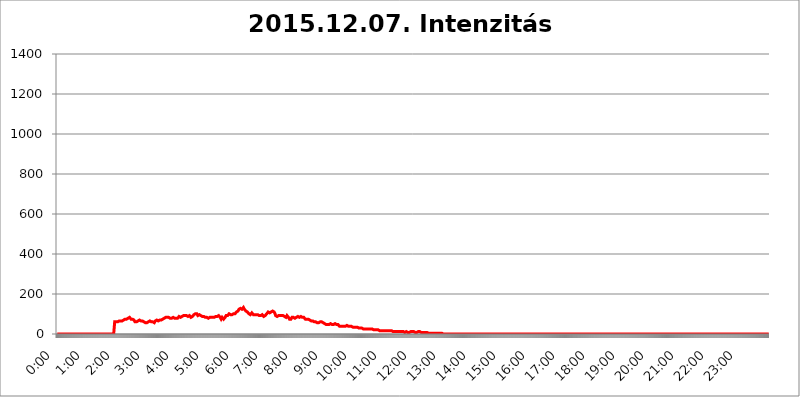
| Category | 2015.12.07. Intenzitás [W/m^2] |
|---|---|
| 0.0 | 0 |
| 0.0006944444444444445 | 0 |
| 0.001388888888888889 | 0 |
| 0.0020833333333333333 | 0 |
| 0.002777777777777778 | 0 |
| 0.003472222222222222 | 0 |
| 0.004166666666666667 | 0 |
| 0.004861111111111111 | 0 |
| 0.005555555555555556 | 0 |
| 0.0062499999999999995 | 0 |
| 0.006944444444444444 | 0 |
| 0.007638888888888889 | 0 |
| 0.008333333333333333 | 0 |
| 0.009027777777777779 | 0 |
| 0.009722222222222222 | 0 |
| 0.010416666666666666 | 0 |
| 0.011111111111111112 | 0 |
| 0.011805555555555555 | 0 |
| 0.012499999999999999 | 0 |
| 0.013194444444444444 | 0 |
| 0.013888888888888888 | 0 |
| 0.014583333333333332 | 0 |
| 0.015277777777777777 | 0 |
| 0.015972222222222224 | 0 |
| 0.016666666666666666 | 0 |
| 0.017361111111111112 | 0 |
| 0.018055555555555557 | 0 |
| 0.01875 | 0 |
| 0.019444444444444445 | 0 |
| 0.02013888888888889 | 0 |
| 0.020833333333333332 | 0 |
| 0.02152777777777778 | 0 |
| 0.022222222222222223 | 0 |
| 0.02291666666666667 | 0 |
| 0.02361111111111111 | 0 |
| 0.024305555555555556 | 0 |
| 0.024999999999999998 | 0 |
| 0.025694444444444447 | 0 |
| 0.02638888888888889 | 0 |
| 0.027083333333333334 | 0 |
| 0.027777777777777776 | 0 |
| 0.02847222222222222 | 0 |
| 0.029166666666666664 | 0 |
| 0.029861111111111113 | 0 |
| 0.030555555555555555 | 0 |
| 0.03125 | 0 |
| 0.03194444444444445 | 0 |
| 0.03263888888888889 | 0 |
| 0.03333333333333333 | 0 |
| 0.034027777777777775 | 0 |
| 0.034722222222222224 | 0 |
| 0.035416666666666666 | 0 |
| 0.036111111111111115 | 0 |
| 0.03680555555555556 | 0 |
| 0.0375 | 0 |
| 0.03819444444444444 | 0 |
| 0.03888888888888889 | 0 |
| 0.03958333333333333 | 0 |
| 0.04027777777777778 | 0 |
| 0.04097222222222222 | 0 |
| 0.041666666666666664 | 0 |
| 0.042361111111111106 | 0 |
| 0.04305555555555556 | 0 |
| 0.043750000000000004 | 0 |
| 0.044444444444444446 | 0 |
| 0.04513888888888889 | 0 |
| 0.04583333333333334 | 0 |
| 0.04652777777777778 | 0 |
| 0.04722222222222222 | 0 |
| 0.04791666666666666 | 0 |
| 0.04861111111111111 | 0 |
| 0.049305555555555554 | 0 |
| 0.049999999999999996 | 0 |
| 0.05069444444444445 | 0 |
| 0.051388888888888894 | 0 |
| 0.052083333333333336 | 0 |
| 0.05277777777777778 | 0 |
| 0.05347222222222222 | 0 |
| 0.05416666666666667 | 0 |
| 0.05486111111111111 | 0 |
| 0.05555555555555555 | 0 |
| 0.05625 | 0 |
| 0.05694444444444444 | 0 |
| 0.057638888888888885 | 0 |
| 0.05833333333333333 | 0 |
| 0.05902777777777778 | 0 |
| 0.059722222222222225 | 0 |
| 0.06041666666666667 | 0 |
| 0.061111111111111116 | 0 |
| 0.06180555555555556 | 0 |
| 0.0625 | 0 |
| 0.06319444444444444 | 0 |
| 0.06388888888888888 | 0 |
| 0.06458333333333334 | 0 |
| 0.06527777777777778 | 0 |
| 0.06597222222222222 | 0 |
| 0.06666666666666667 | 0 |
| 0.06736111111111111 | 0 |
| 0.06805555555555555 | 0 |
| 0.06874999999999999 | 0 |
| 0.06944444444444443 | 0 |
| 0.07013888888888889 | 0 |
| 0.07083333333333333 | 0 |
| 0.07152777777777779 | 0 |
| 0.07222222222222223 | 0 |
| 0.07291666666666667 | 0 |
| 0.07361111111111111 | 0 |
| 0.07430555555555556 | 0 |
| 0.075 | 0 |
| 0.07569444444444444 | 0 |
| 0.0763888888888889 | 0 |
| 0.07708333333333334 | 0 |
| 0.07777777777777778 | 0 |
| 0.07847222222222222 | 0 |
| 0.07916666666666666 | 0 |
| 0.0798611111111111 | 0 |
| 0.08055555555555556 | 60.85 |
| 0.08125 | 60.85 |
| 0.08194444444444444 | 60.85 |
| 0.08263888888888889 | 60.85 |
| 0.08333333333333333 | 60.85 |
| 0.08402777777777777 | 60.85 |
| 0.08472222222222221 | 60.85 |
| 0.08541666666666665 | 60.85 |
| 0.08611111111111112 | 60.85 |
| 0.08680555555555557 | 65.31 |
| 0.08750000000000001 | 65.31 |
| 0.08819444444444445 | 65.31 |
| 0.08888888888888889 | 65.31 |
| 0.08958333333333333 | 65.31 |
| 0.09027777777777778 | 65.31 |
| 0.09097222222222222 | 65.31 |
| 0.09166666666666667 | 69.775 |
| 0.09236111111111112 | 69.775 |
| 0.09305555555555556 | 69.775 |
| 0.09375 | 74.246 |
| 0.09444444444444444 | 74.246 |
| 0.09513888888888888 | 74.246 |
| 0.09583333333333333 | 74.246 |
| 0.09652777777777777 | 74.246 |
| 0.09722222222222222 | 74.246 |
| 0.09791666666666667 | 74.246 |
| 0.09861111111111111 | 78.722 |
| 0.09930555555555555 | 78.722 |
| 0.09999999999999999 | 83.205 |
| 0.10069444444444443 | 83.205 |
| 0.1013888888888889 | 83.205 |
| 0.10208333333333335 | 78.722 |
| 0.10277777777777779 | 78.722 |
| 0.10347222222222223 | 74.246 |
| 0.10416666666666667 | 74.246 |
| 0.10486111111111111 | 74.246 |
| 0.10555555555555556 | 74.246 |
| 0.10625 | 74.246 |
| 0.10694444444444444 | 69.775 |
| 0.1076388888888889 | 69.775 |
| 0.10833333333333334 | 65.31 |
| 0.10902777777777778 | 60.85 |
| 0.10972222222222222 | 56.398 |
| 0.1111111111111111 | 56.398 |
| 0.11180555555555556 | 60.85 |
| 0.11180555555555556 | 60.85 |
| 0.1125 | 65.31 |
| 0.11319444444444444 | 65.31 |
| 0.11388888888888889 | 65.31 |
| 0.11458333333333333 | 69.775 |
| 0.11527777777777777 | 69.775 |
| 0.11597222222222221 | 69.775 |
| 0.11666666666666665 | 69.775 |
| 0.1173611111111111 | 65.31 |
| 0.11805555555555557 | 65.31 |
| 0.11944444444444445 | 65.31 |
| 0.12013888888888889 | 65.31 |
| 0.12083333333333333 | 65.31 |
| 0.12152777777777778 | 60.85 |
| 0.12222222222222223 | 60.85 |
| 0.12291666666666667 | 56.398 |
| 0.12291666666666667 | 56.398 |
| 0.12361111111111112 | 56.398 |
| 0.12430555555555556 | 56.398 |
| 0.125 | 56.398 |
| 0.12569444444444444 | 56.398 |
| 0.12638888888888888 | 56.398 |
| 0.12708333333333333 | 56.398 |
| 0.16875 | 60.85 |
| 0.12847222222222224 | 56.398 |
| 0.12916666666666668 | 60.85 |
| 0.12986111111111112 | 65.31 |
| 0.13055555555555556 | 65.31 |
| 0.13125 | 60.85 |
| 0.13194444444444445 | 60.85 |
| 0.1326388888888889 | 60.85 |
| 0.13333333333333333 | 60.85 |
| 0.13402777777777777 | 60.85 |
| 0.13402777777777777 | 60.85 |
| 0.13472222222222222 | 56.398 |
| 0.13541666666666666 | 56.398 |
| 0.1361111111111111 | 60.85 |
| 0.13749999999999998 | 65.31 |
| 0.13819444444444443 | 65.31 |
| 0.1388888888888889 | 69.775 |
| 0.13958333333333334 | 69.775 |
| 0.14027777777777778 | 69.775 |
| 0.14097222222222222 | 65.31 |
| 0.14166666666666666 | 65.31 |
| 0.1423611111111111 | 69.775 |
| 0.14305555555555557 | 69.775 |
| 0.14375000000000002 | 69.775 |
| 0.14444444444444446 | 69.775 |
| 0.1451388888888889 | 69.775 |
| 0.1451388888888889 | 69.775 |
| 0.14652777777777778 | 74.246 |
| 0.14722222222222223 | 74.246 |
| 0.14791666666666667 | 74.246 |
| 0.1486111111111111 | 78.722 |
| 0.14930555555555555 | 78.722 |
| 0.15 | 78.722 |
| 0.15069444444444444 | 78.722 |
| 0.15138888888888888 | 83.205 |
| 0.15208333333333332 | 83.205 |
| 0.15277777777777776 | 83.205 |
| 0.15347222222222223 | 83.205 |
| 0.15416666666666667 | 83.205 |
| 0.15486111111111112 | 83.205 |
| 0.15555555555555556 | 83.205 |
| 0.15625 | 83.205 |
| 0.15694444444444444 | 83.205 |
| 0.15763888888888888 | 78.722 |
| 0.15833333333333333 | 78.722 |
| 0.15902777777777777 | 78.722 |
| 0.15972222222222224 | 78.722 |
| 0.16041666666666668 | 78.722 |
| 0.16111111111111112 | 78.722 |
| 0.16180555555555556 | 83.205 |
| 0.1625 | 83.205 |
| 0.16319444444444445 | 78.722 |
| 0.1638888888888889 | 78.722 |
| 0.16458333333333333 | 78.722 |
| 0.16527777777777777 | 78.722 |
| 0.16597222222222222 | 78.722 |
| 0.16666666666666666 | 78.722 |
| 0.1673611111111111 | 78.722 |
| 0.16805555555555554 | 74.246 |
| 0.16874999999999998 | 78.722 |
| 0.16944444444444443 | 83.205 |
| 0.17013888888888887 | 83.205 |
| 0.1708333333333333 | 87.692 |
| 0.17152777777777775 | 87.692 |
| 0.17222222222222225 | 87.692 |
| 0.1729166666666667 | 83.205 |
| 0.17361111111111113 | 83.205 |
| 0.17430555555555557 | 87.692 |
| 0.17500000000000002 | 87.692 |
| 0.17569444444444446 | 87.692 |
| 0.1763888888888889 | 87.692 |
| 0.17708333333333334 | 92.184 |
| 0.17777777777777778 | 92.184 |
| 0.17847222222222223 | 92.184 |
| 0.17916666666666667 | 92.184 |
| 0.1798611111111111 | 92.184 |
| 0.18055555555555555 | 92.184 |
| 0.18125 | 92.184 |
| 0.18194444444444444 | 87.692 |
| 0.1826388888888889 | 87.692 |
| 0.18333333333333335 | 87.692 |
| 0.1840277777777778 | 87.692 |
| 0.18472222222222223 | 87.692 |
| 0.18541666666666667 | 92.184 |
| 0.18611111111111112 | 87.692 |
| 0.18680555555555556 | 87.692 |
| 0.1875 | 83.205 |
| 0.18819444444444444 | 83.205 |
| 0.18888888888888888 | 83.205 |
| 0.18958333333333333 | 87.692 |
| 0.19027777777777777 | 87.692 |
| 0.1909722222222222 | 92.184 |
| 0.19166666666666665 | 96.682 |
| 0.19236111111111112 | 96.682 |
| 0.19305555555555554 | 96.682 |
| 0.19375 | 101.184 |
| 0.19444444444444445 | 101.184 |
| 0.1951388888888889 | 101.184 |
| 0.19583333333333333 | 101.184 |
| 0.19652777777777777 | 96.682 |
| 0.19722222222222222 | 92.184 |
| 0.19791666666666666 | 92.184 |
| 0.1986111111111111 | 96.682 |
| 0.19930555555555554 | 96.682 |
| 0.19999999999999998 | 96.682 |
| 0.20069444444444443 | 96.682 |
| 0.20138888888888887 | 92.184 |
| 0.2020833333333333 | 92.184 |
| 0.2027777777777778 | 92.184 |
| 0.2034722222222222 | 87.692 |
| 0.2041666666666667 | 87.692 |
| 0.20486111111111113 | 87.692 |
| 0.20555555555555557 | 87.692 |
| 0.20625000000000002 | 87.692 |
| 0.20694444444444446 | 83.205 |
| 0.2076388888888889 | 83.205 |
| 0.20833333333333334 | 83.205 |
| 0.20902777777777778 | 83.205 |
| 0.20972222222222223 | 83.205 |
| 0.21041666666666667 | 83.205 |
| 0.2111111111111111 | 78.722 |
| 0.21180555555555555 | 78.722 |
| 0.2125 | 83.205 |
| 0.21319444444444444 | 83.205 |
| 0.2138888888888889 | 83.205 |
| 0.21458333333333335 | 83.205 |
| 0.2152777777777778 | 83.205 |
| 0.21597222222222223 | 83.205 |
| 0.21666666666666667 | 83.205 |
| 0.21736111111111112 | 87.692 |
| 0.21805555555555556 | 83.205 |
| 0.21875 | 83.205 |
| 0.21944444444444444 | 78.722 |
| 0.22013888888888888 | 83.205 |
| 0.22083333333333333 | 87.692 |
| 0.22152777777777777 | 87.692 |
| 0.2222222222222222 | 87.692 |
| 0.22291666666666665 | 87.692 |
| 0.2236111111111111 | 87.692 |
| 0.22430555555555556 | 87.692 |
| 0.225 | 87.692 |
| 0.22569444444444445 | 87.692 |
| 0.2263888888888889 | 92.184 |
| 0.22708333333333333 | 92.184 |
| 0.22777777777777777 | 87.692 |
| 0.22847222222222222 | 83.205 |
| 0.22916666666666666 | 78.722 |
| 0.2298611111111111 | 74.246 |
| 0.23055555555555554 | 78.722 |
| 0.23124999999999998 | 83.205 |
| 0.23194444444444443 | 83.205 |
| 0.23263888888888887 | 78.722 |
| 0.2333333333333333 | 74.246 |
| 0.2340277777777778 | 74.246 |
| 0.2347222222222222 | 78.722 |
| 0.2354166666666667 | 83.205 |
| 0.23611111111111113 | 87.692 |
| 0.23680555555555557 | 92.184 |
| 0.23750000000000002 | 92.184 |
| 0.23819444444444446 | 92.184 |
| 0.2388888888888889 | 92.184 |
| 0.23958333333333334 | 92.184 |
| 0.24027777777777778 | 96.682 |
| 0.24097222222222223 | 101.184 |
| 0.24166666666666667 | 96.682 |
| 0.2423611111111111 | 96.682 |
| 0.24305555555555555 | 96.682 |
| 0.24375 | 96.682 |
| 0.24444444444444446 | 92.184 |
| 0.24513888888888888 | 96.682 |
| 0.24583333333333335 | 101.184 |
| 0.2465277777777778 | 101.184 |
| 0.24722222222222223 | 101.184 |
| 0.24791666666666667 | 101.184 |
| 0.24861111111111112 | 96.682 |
| 0.24930555555555556 | 101.184 |
| 0.25 | 105.69 |
| 0.25069444444444444 | 105.69 |
| 0.2513888888888889 | 110.201 |
| 0.2520833333333333 | 110.201 |
| 0.25277777777777777 | 110.201 |
| 0.2534722222222222 | 114.716 |
| 0.25416666666666665 | 119.235 |
| 0.2548611111111111 | 123.758 |
| 0.2555555555555556 | 119.235 |
| 0.25625000000000003 | 128.284 |
| 0.2569444444444445 | 128.284 |
| 0.2576388888888889 | 123.758 |
| 0.25833333333333336 | 123.758 |
| 0.2590277777777778 | 123.758 |
| 0.25972222222222224 | 123.758 |
| 0.2604166666666667 | 128.284 |
| 0.2611111111111111 | 132.814 |
| 0.26180555555555557 | 128.284 |
| 0.2625 | 123.758 |
| 0.26319444444444445 | 119.235 |
| 0.2638888888888889 | 119.235 |
| 0.26458333333333334 | 114.716 |
| 0.2652777777777778 | 110.201 |
| 0.2659722222222222 | 110.201 |
| 0.26666666666666666 | 110.201 |
| 0.2673611111111111 | 110.201 |
| 0.26805555555555555 | 105.69 |
| 0.26875 | 101.184 |
| 0.26944444444444443 | 101.184 |
| 0.2701388888888889 | 96.682 |
| 0.2708333333333333 | 96.682 |
| 0.27152777777777776 | 101.184 |
| 0.2722222222222222 | 101.184 |
| 0.27291666666666664 | 105.69 |
| 0.2736111111111111 | 101.184 |
| 0.2743055555555555 | 101.184 |
| 0.27499999999999997 | 96.682 |
| 0.27569444444444446 | 96.682 |
| 0.27638888888888885 | 96.682 |
| 0.27708333333333335 | 96.682 |
| 0.2777777777777778 | 96.682 |
| 0.27847222222222223 | 96.682 |
| 0.2791666666666667 | 96.682 |
| 0.2798611111111111 | 96.682 |
| 0.28055555555555556 | 96.682 |
| 0.28125 | 96.682 |
| 0.28194444444444444 | 96.682 |
| 0.2826388888888889 | 96.682 |
| 0.2833333333333333 | 92.184 |
| 0.28402777777777777 | 92.184 |
| 0.2847222222222222 | 92.184 |
| 0.28541666666666665 | 92.184 |
| 0.28611111111111115 | 96.682 |
| 0.28680555555555554 | 96.682 |
| 0.28750000000000003 | 96.682 |
| 0.2881944444444445 | 92.184 |
| 0.2888888888888889 | 92.184 |
| 0.28958333333333336 | 87.692 |
| 0.2902777777777778 | 87.692 |
| 0.29097222222222224 | 87.692 |
| 0.2916666666666667 | 92.184 |
| 0.2923611111111111 | 96.682 |
| 0.29305555555555557 | 96.682 |
| 0.29375 | 101.184 |
| 0.29444444444444445 | 105.69 |
| 0.2951388888888889 | 105.69 |
| 0.29583333333333334 | 110.201 |
| 0.2965277777777778 | 110.201 |
| 0.2972222222222222 | 105.69 |
| 0.29791666666666666 | 105.69 |
| 0.2986111111111111 | 105.69 |
| 0.29930555555555555 | 110.201 |
| 0.3 | 110.201 |
| 0.30069444444444443 | 114.716 |
| 0.3013888888888889 | 114.716 |
| 0.3020833333333333 | 114.716 |
| 0.30277777777777776 | 114.716 |
| 0.3034722222222222 | 110.201 |
| 0.30416666666666664 | 110.201 |
| 0.3048611111111111 | 105.69 |
| 0.3055555555555555 | 101.184 |
| 0.30624999999999997 | 92.184 |
| 0.3069444444444444 | 87.692 |
| 0.3076388888888889 | 87.692 |
| 0.30833333333333335 | 87.692 |
| 0.3090277777777778 | 87.692 |
| 0.30972222222222223 | 87.692 |
| 0.3104166666666667 | 92.184 |
| 0.3111111111111111 | 92.184 |
| 0.31180555555555556 | 92.184 |
| 0.3125 | 92.184 |
| 0.31319444444444444 | 92.184 |
| 0.3138888888888889 | 92.184 |
| 0.3145833333333333 | 92.184 |
| 0.31527777777777777 | 92.184 |
| 0.3159722222222222 | 87.692 |
| 0.31666666666666665 | 92.184 |
| 0.31736111111111115 | 92.184 |
| 0.31805555555555554 | 92.184 |
| 0.31875000000000003 | 87.692 |
| 0.3194444444444445 | 83.205 |
| 0.3201388888888889 | 83.205 |
| 0.32083333333333336 | 83.205 |
| 0.3215277777777778 | 87.692 |
| 0.32222222222222224 | 92.184 |
| 0.3229166666666667 | 92.184 |
| 0.3236111111111111 | 92.184 |
| 0.32430555555555557 | 83.205 |
| 0.325 | 78.722 |
| 0.32569444444444445 | 74.246 |
| 0.3263888888888889 | 74.246 |
| 0.32708333333333334 | 74.246 |
| 0.3277777777777778 | 74.246 |
| 0.3284722222222222 | 78.722 |
| 0.32916666666666666 | 83.205 |
| 0.3298611111111111 | 83.205 |
| 0.33055555555555555 | 83.205 |
| 0.33125 | 83.205 |
| 0.33194444444444443 | 83.205 |
| 0.3326388888888889 | 83.205 |
| 0.3333333333333333 | 78.722 |
| 0.3340277777777778 | 83.205 |
| 0.3347222222222222 | 83.205 |
| 0.3354166666666667 | 83.205 |
| 0.3361111111111111 | 83.205 |
| 0.3368055555555556 | 83.205 |
| 0.33749999999999997 | 87.692 |
| 0.33819444444444446 | 92.184 |
| 0.33888888888888885 | 87.692 |
| 0.33958333333333335 | 83.205 |
| 0.34027777777777773 | 83.205 |
| 0.34097222222222223 | 87.692 |
| 0.3416666666666666 | 87.692 |
| 0.3423611111111111 | 87.692 |
| 0.3430555555555555 | 83.205 |
| 0.34375 | 83.205 |
| 0.3444444444444445 | 83.205 |
| 0.3451388888888889 | 83.205 |
| 0.3458333333333334 | 83.205 |
| 0.34652777777777777 | 83.205 |
| 0.34722222222222227 | 78.722 |
| 0.34791666666666665 | 74.246 |
| 0.34861111111111115 | 74.246 |
| 0.34930555555555554 | 74.246 |
| 0.35000000000000003 | 74.246 |
| 0.3506944444444444 | 74.246 |
| 0.3513888888888889 | 74.246 |
| 0.3520833333333333 | 74.246 |
| 0.3527777777777778 | 74.246 |
| 0.3534722222222222 | 74.246 |
| 0.3541666666666667 | 69.775 |
| 0.3548611111111111 | 69.775 |
| 0.35555555555555557 | 69.775 |
| 0.35625 | 65.31 |
| 0.35694444444444445 | 65.31 |
| 0.3576388888888889 | 65.31 |
| 0.35833333333333334 | 65.31 |
| 0.3590277777777778 | 65.31 |
| 0.3597222222222222 | 65.31 |
| 0.36041666666666666 | 60.85 |
| 0.3611111111111111 | 60.85 |
| 0.36180555555555555 | 60.85 |
| 0.3625 | 60.85 |
| 0.36319444444444443 | 60.85 |
| 0.3638888888888889 | 56.398 |
| 0.3645833333333333 | 56.398 |
| 0.3652777777777778 | 56.398 |
| 0.3659722222222222 | 56.398 |
| 0.3666666666666667 | 56.398 |
| 0.3673611111111111 | 56.398 |
| 0.3680555555555556 | 56.398 |
| 0.36874999999999997 | 60.85 |
| 0.36944444444444446 | 60.85 |
| 0.37013888888888885 | 56.398 |
| 0.37083333333333335 | 60.85 |
| 0.37152777777777773 | 60.85 |
| 0.37222222222222223 | 56.398 |
| 0.3729166666666666 | 56.398 |
| 0.3736111111111111 | 56.398 |
| 0.3743055555555555 | 51.951 |
| 0.375 | 51.951 |
| 0.3756944444444445 | 51.951 |
| 0.3763888888888889 | 51.951 |
| 0.3770833333333334 | 47.511 |
| 0.37777777777777777 | 47.511 |
| 0.37847222222222227 | 47.511 |
| 0.37916666666666665 | 47.511 |
| 0.37986111111111115 | 47.511 |
| 0.38055555555555554 | 47.511 |
| 0.38125000000000003 | 47.511 |
| 0.3819444444444444 | 47.511 |
| 0.3826388888888889 | 51.951 |
| 0.3833333333333333 | 51.951 |
| 0.3840277777777778 | 51.951 |
| 0.3847222222222222 | 47.511 |
| 0.3854166666666667 | 47.511 |
| 0.3861111111111111 | 47.511 |
| 0.38680555555555557 | 47.511 |
| 0.3875 | 47.511 |
| 0.38819444444444445 | 51.951 |
| 0.3888888888888889 | 51.951 |
| 0.38958333333333334 | 51.951 |
| 0.3902777777777778 | 51.951 |
| 0.3909722222222222 | 51.951 |
| 0.39166666666666666 | 47.511 |
| 0.3923611111111111 | 47.511 |
| 0.39305555555555555 | 47.511 |
| 0.39375 | 47.511 |
| 0.39444444444444443 | 43.079 |
| 0.3951388888888889 | 43.079 |
| 0.3958333333333333 | 38.653 |
| 0.3965277777777778 | 38.653 |
| 0.3972222222222222 | 38.653 |
| 0.3979166666666667 | 38.653 |
| 0.3986111111111111 | 38.653 |
| 0.3993055555555556 | 38.653 |
| 0.39999999999999997 | 38.653 |
| 0.40069444444444446 | 38.653 |
| 0.40138888888888885 | 38.653 |
| 0.40208333333333335 | 38.653 |
| 0.40277777777777773 | 38.653 |
| 0.40347222222222223 | 38.653 |
| 0.4041666666666666 | 38.653 |
| 0.4048611111111111 | 43.079 |
| 0.4055555555555555 | 43.079 |
| 0.40625 | 43.079 |
| 0.4069444444444445 | 43.079 |
| 0.4076388888888889 | 38.653 |
| 0.4083333333333334 | 38.653 |
| 0.40902777777777777 | 38.653 |
| 0.40972222222222227 | 38.653 |
| 0.41041666666666665 | 38.653 |
| 0.41111111111111115 | 38.653 |
| 0.41180555555555554 | 38.653 |
| 0.41250000000000003 | 38.653 |
| 0.4131944444444444 | 38.653 |
| 0.4138888888888889 | 38.653 |
| 0.4145833333333333 | 34.234 |
| 0.4152777777777778 | 34.234 |
| 0.4159722222222222 | 34.234 |
| 0.4166666666666667 | 34.234 |
| 0.4173611111111111 | 34.234 |
| 0.41805555555555557 | 34.234 |
| 0.41875 | 34.234 |
| 0.41944444444444445 | 34.234 |
| 0.4201388888888889 | 34.234 |
| 0.42083333333333334 | 34.234 |
| 0.4215277777777778 | 34.234 |
| 0.4222222222222222 | 29.823 |
| 0.42291666666666666 | 29.823 |
| 0.4236111111111111 | 29.823 |
| 0.42430555555555555 | 29.823 |
| 0.425 | 29.823 |
| 0.42569444444444443 | 29.823 |
| 0.4263888888888889 | 29.823 |
| 0.4270833333333333 | 29.823 |
| 0.4277777777777778 | 29.823 |
| 0.4284722222222222 | 29.823 |
| 0.4291666666666667 | 25.419 |
| 0.4298611111111111 | 25.419 |
| 0.4305555555555556 | 25.419 |
| 0.43124999999999997 | 25.419 |
| 0.43194444444444446 | 25.419 |
| 0.43263888888888885 | 25.419 |
| 0.43333333333333335 | 25.419 |
| 0.43402777777777773 | 25.419 |
| 0.43472222222222223 | 25.419 |
| 0.4354166666666666 | 25.419 |
| 0.4361111111111111 | 25.419 |
| 0.4368055555555555 | 25.419 |
| 0.4375 | 25.419 |
| 0.4381944444444445 | 25.419 |
| 0.4388888888888889 | 25.419 |
| 0.4395833333333334 | 25.419 |
| 0.44027777777777777 | 25.419 |
| 0.44097222222222227 | 25.419 |
| 0.44166666666666665 | 25.419 |
| 0.44236111111111115 | 25.419 |
| 0.44305555555555554 | 21.024 |
| 0.44375000000000003 | 21.024 |
| 0.4444444444444444 | 21.024 |
| 0.4451388888888889 | 21.024 |
| 0.4458333333333333 | 21.024 |
| 0.4465277777777778 | 21.024 |
| 0.4472222222222222 | 21.024 |
| 0.4479166666666667 | 21.024 |
| 0.4486111111111111 | 16.636 |
| 0.44930555555555557 | 16.636 |
| 0.45 | 21.024 |
| 0.45069444444444445 | 16.636 |
| 0.4513888888888889 | 16.636 |
| 0.45208333333333334 | 16.636 |
| 0.4527777777777778 | 16.636 |
| 0.4534722222222222 | 16.636 |
| 0.45416666666666666 | 16.636 |
| 0.4548611111111111 | 16.636 |
| 0.45555555555555555 | 16.636 |
| 0.45625 | 16.636 |
| 0.45694444444444443 | 16.636 |
| 0.4576388888888889 | 16.636 |
| 0.4583333333333333 | 16.636 |
| 0.4590277777777778 | 16.636 |
| 0.4597222222222222 | 16.636 |
| 0.4604166666666667 | 16.636 |
| 0.4611111111111111 | 16.636 |
| 0.4618055555555556 | 16.636 |
| 0.46249999999999997 | 16.636 |
| 0.46319444444444446 | 16.636 |
| 0.46388888888888885 | 16.636 |
| 0.46458333333333335 | 16.636 |
| 0.46527777777777773 | 16.636 |
| 0.46597222222222223 | 16.636 |
| 0.4666666666666666 | 16.636 |
| 0.4673611111111111 | 16.636 |
| 0.4680555555555555 | 16.636 |
| 0.46875 | 16.636 |
| 0.4694444444444445 | 16.636 |
| 0.4701388888888889 | 16.636 |
| 0.4708333333333334 | 12.257 |
| 0.47152777777777777 | 12.257 |
| 0.47222222222222227 | 12.257 |
| 0.47291666666666665 | 12.257 |
| 0.47361111111111115 | 12.257 |
| 0.47430555555555554 | 12.257 |
| 0.47500000000000003 | 12.257 |
| 0.4756944444444444 | 12.257 |
| 0.4763888888888889 | 12.257 |
| 0.4770833333333333 | 12.257 |
| 0.4777777777777778 | 12.257 |
| 0.4784722222222222 | 12.257 |
| 0.4791666666666667 | 12.257 |
| 0.4798611111111111 | 12.257 |
| 0.48055555555555557 | 12.257 |
| 0.48125 | 12.257 |
| 0.48194444444444445 | 12.257 |
| 0.4826388888888889 | 12.257 |
| 0.48333333333333334 | 12.257 |
| 0.4840277777777778 | 12.257 |
| 0.4847222222222222 | 12.257 |
| 0.48541666666666666 | 12.257 |
| 0.4861111111111111 | 12.257 |
| 0.48680555555555555 | 12.257 |
| 0.4875 | 7.887 |
| 0.48819444444444443 | 7.887 |
| 0.4888888888888889 | 7.887 |
| 0.4895833333333333 | 12.257 |
| 0.4902777777777778 | 12.257 |
| 0.4909722222222222 | 12.257 |
| 0.4916666666666667 | 7.887 |
| 0.4923611111111111 | 7.887 |
| 0.4930555555555556 | 7.887 |
| 0.49374999999999997 | 7.887 |
| 0.49444444444444446 | 7.887 |
| 0.49513888888888885 | 12.257 |
| 0.49583333333333335 | 12.257 |
| 0.49652777777777773 | 12.257 |
| 0.49722222222222223 | 12.257 |
| 0.4979166666666666 | 12.257 |
| 0.4986111111111111 | 12.257 |
| 0.4993055555555555 | 12.257 |
| 0.5 | 12.257 |
| 0.5006944444444444 | 12.257 |
| 0.5013888888888889 | 7.887 |
| 0.5020833333333333 | 7.887 |
| 0.5027777777777778 | 7.887 |
| 0.5034722222222222 | 7.887 |
| 0.5041666666666667 | 7.887 |
| 0.5048611111111111 | 12.257 |
| 0.5055555555555555 | 12.257 |
| 0.50625 | 12.257 |
| 0.5069444444444444 | 12.257 |
| 0.5076388888888889 | 12.257 |
| 0.5083333333333333 | 12.257 |
| 0.5090277777777777 | 7.887 |
| 0.5097222222222222 | 7.887 |
| 0.5104166666666666 | 7.887 |
| 0.5111111111111112 | 7.887 |
| 0.5118055555555555 | 7.887 |
| 0.5125000000000001 | 7.887 |
| 0.5131944444444444 | 7.887 |
| 0.513888888888889 | 7.887 |
| 0.5145833333333333 | 7.887 |
| 0.5152777777777778 | 7.887 |
| 0.5159722222222222 | 7.887 |
| 0.5166666666666667 | 7.887 |
| 0.517361111111111 | 7.887 |
| 0.5180555555555556 | 7.887 |
| 0.5187499999999999 | 7.887 |
| 0.5194444444444445 | 7.887 |
| 0.5201388888888888 | 3.525 |
| 0.5208333333333334 | 3.525 |
| 0.5215277777777778 | 3.525 |
| 0.5222222222222223 | 3.525 |
| 0.5229166666666667 | 3.525 |
| 0.5236111111111111 | 3.525 |
| 0.5243055555555556 | 3.525 |
| 0.525 | 3.525 |
| 0.5256944444444445 | 3.525 |
| 0.5263888888888889 | 3.525 |
| 0.5270833333333333 | 3.525 |
| 0.5277777777777778 | 3.525 |
| 0.5284722222222222 | 3.525 |
| 0.5291666666666667 | 3.525 |
| 0.5298611111111111 | 3.525 |
| 0.5305555555555556 | 3.525 |
| 0.53125 | 3.525 |
| 0.5319444444444444 | 3.525 |
| 0.5326388888888889 | 3.525 |
| 0.5333333333333333 | 3.525 |
| 0.5340277777777778 | 3.525 |
| 0.5347222222222222 | 3.525 |
| 0.5354166666666667 | 3.525 |
| 0.5361111111111111 | 3.525 |
| 0.5368055555555555 | 0 |
| 0.5375 | 3.525 |
| 0.5381944444444444 | 3.525 |
| 0.5388888888888889 | 0 |
| 0.5395833333333333 | 3.525 |
| 0.5402777777777777 | 3.525 |
| 0.5409722222222222 | 3.525 |
| 0.5416666666666666 | 0 |
| 0.5423611111111112 | 0 |
| 0.5430555555555555 | 0 |
| 0.5437500000000001 | 0 |
| 0.5444444444444444 | 0 |
| 0.545138888888889 | 0 |
| 0.5458333333333333 | 0 |
| 0.5465277777777778 | 0 |
| 0.5472222222222222 | 0 |
| 0.5479166666666667 | 0 |
| 0.548611111111111 | 0 |
| 0.5493055555555556 | 0 |
| 0.5499999999999999 | 0 |
| 0.5506944444444445 | 0 |
| 0.5513888888888888 | 0 |
| 0.5520833333333334 | 0 |
| 0.5527777777777778 | 0 |
| 0.5534722222222223 | 0 |
| 0.5541666666666667 | 0 |
| 0.5548611111111111 | 0 |
| 0.5555555555555556 | 0 |
| 0.55625 | 0 |
| 0.5569444444444445 | 0 |
| 0.5576388888888889 | 0 |
| 0.5583333333333333 | 0 |
| 0.5590277777777778 | 0 |
| 0.5597222222222222 | 0 |
| 0.5604166666666667 | 0 |
| 0.5611111111111111 | 0 |
| 0.5618055555555556 | 0 |
| 0.5625 | 0 |
| 0.5631944444444444 | 0 |
| 0.5638888888888889 | 0 |
| 0.5645833333333333 | 0 |
| 0.5652777777777778 | 0 |
| 0.5659722222222222 | 0 |
| 0.5666666666666667 | 0 |
| 0.5673611111111111 | 0 |
| 0.5680555555555555 | 0 |
| 0.56875 | 0 |
| 0.5694444444444444 | 0 |
| 0.5701388888888889 | 0 |
| 0.5708333333333333 | 0 |
| 0.5715277777777777 | 0 |
| 0.5722222222222222 | 0 |
| 0.5729166666666666 | 0 |
| 0.5736111111111112 | 0 |
| 0.5743055555555555 | 0 |
| 0.5750000000000001 | 0 |
| 0.5756944444444444 | 0 |
| 0.576388888888889 | 0 |
| 0.5770833333333333 | 0 |
| 0.5777777777777778 | 0 |
| 0.5784722222222222 | 0 |
| 0.5791666666666667 | 0 |
| 0.579861111111111 | 0 |
| 0.5805555555555556 | 0 |
| 0.5812499999999999 | 0 |
| 0.5819444444444445 | 0 |
| 0.5826388888888888 | 0 |
| 0.5833333333333334 | 0 |
| 0.5840277777777778 | 0 |
| 0.5847222222222223 | 0 |
| 0.5854166666666667 | 0 |
| 0.5861111111111111 | 0 |
| 0.5868055555555556 | 0 |
| 0.5875 | 0 |
| 0.5881944444444445 | 0 |
| 0.5888888888888889 | 0 |
| 0.5895833333333333 | 0 |
| 0.5902777777777778 | 0 |
| 0.5909722222222222 | 0 |
| 0.5916666666666667 | 0 |
| 0.5923611111111111 | 0 |
| 0.5930555555555556 | 0 |
| 0.59375 | 0 |
| 0.5944444444444444 | 0 |
| 0.5951388888888889 | 0 |
| 0.5958333333333333 | 0 |
| 0.5965277777777778 | 0 |
| 0.5972222222222222 | 0 |
| 0.5979166666666667 | 0 |
| 0.5986111111111111 | 0 |
| 0.5993055555555555 | 0 |
| 0.6 | 0 |
| 0.6006944444444444 | 0 |
| 0.6013888888888889 | 0 |
| 0.6020833333333333 | 0 |
| 0.6027777777777777 | 0 |
| 0.6034722222222222 | 0 |
| 0.6041666666666666 | 0 |
| 0.6048611111111112 | 0 |
| 0.6055555555555555 | 0 |
| 0.6062500000000001 | 0 |
| 0.6069444444444444 | 0 |
| 0.607638888888889 | 0 |
| 0.6083333333333333 | 0 |
| 0.6090277777777778 | 0 |
| 0.6097222222222222 | 0 |
| 0.6104166666666667 | 0 |
| 0.611111111111111 | 0 |
| 0.6118055555555556 | 0 |
| 0.6124999999999999 | 0 |
| 0.6131944444444445 | 0 |
| 0.6138888888888888 | 0 |
| 0.6145833333333334 | 0 |
| 0.6152777777777778 | 0 |
| 0.6159722222222223 | 0 |
| 0.6166666666666667 | 0 |
| 0.6173611111111111 | 0 |
| 0.6180555555555556 | 0 |
| 0.61875 | 0 |
| 0.6194444444444445 | 0 |
| 0.6201388888888889 | 0 |
| 0.6208333333333333 | 0 |
| 0.6215277777777778 | 0 |
| 0.6222222222222222 | 0 |
| 0.6229166666666667 | 0 |
| 0.6236111111111111 | 0 |
| 0.6243055555555556 | 0 |
| 0.625 | 0 |
| 0.6256944444444444 | 0 |
| 0.6263888888888889 | 0 |
| 0.6270833333333333 | 0 |
| 0.6277777777777778 | 0 |
| 0.6284722222222222 | 0 |
| 0.6291666666666667 | 0 |
| 0.6298611111111111 | 0 |
| 0.6305555555555555 | 0 |
| 0.63125 | 0 |
| 0.6319444444444444 | 0 |
| 0.6326388888888889 | 0 |
| 0.6333333333333333 | 0 |
| 0.6340277777777777 | 0 |
| 0.6347222222222222 | 0 |
| 0.6354166666666666 | 0 |
| 0.6361111111111112 | 0 |
| 0.6368055555555555 | 0 |
| 0.6375000000000001 | 0 |
| 0.6381944444444444 | 0 |
| 0.638888888888889 | 0 |
| 0.6395833333333333 | 0 |
| 0.6402777777777778 | 0 |
| 0.6409722222222222 | 0 |
| 0.6416666666666667 | 0 |
| 0.642361111111111 | 0 |
| 0.6430555555555556 | 0 |
| 0.6437499999999999 | 0 |
| 0.6444444444444445 | 0 |
| 0.6451388888888888 | 0 |
| 0.6458333333333334 | 0 |
| 0.6465277777777778 | 0 |
| 0.6472222222222223 | 0 |
| 0.6479166666666667 | 0 |
| 0.6486111111111111 | 0 |
| 0.6493055555555556 | 0 |
| 0.65 | 0 |
| 0.6506944444444445 | 0 |
| 0.6513888888888889 | 0 |
| 0.6520833333333333 | 0 |
| 0.6527777777777778 | 0 |
| 0.6534722222222222 | 0 |
| 0.6541666666666667 | 0 |
| 0.6548611111111111 | 0 |
| 0.6555555555555556 | 0 |
| 0.65625 | 0 |
| 0.6569444444444444 | 0 |
| 0.6576388888888889 | 0 |
| 0.6583333333333333 | 0 |
| 0.6590277777777778 | 0 |
| 0.6597222222222222 | 0 |
| 0.6604166666666667 | 0 |
| 0.6611111111111111 | 0 |
| 0.6618055555555555 | 0 |
| 0.6625 | 0 |
| 0.6631944444444444 | 0 |
| 0.6638888888888889 | 0 |
| 0.6645833333333333 | 0 |
| 0.6652777777777777 | 0 |
| 0.6659722222222222 | 0 |
| 0.6666666666666666 | 0 |
| 0.6673611111111111 | 0 |
| 0.6680555555555556 | 0 |
| 0.6687500000000001 | 0 |
| 0.6694444444444444 | 0 |
| 0.6701388888888888 | 0 |
| 0.6708333333333334 | 0 |
| 0.6715277777777778 | 0 |
| 0.6722222222222222 | 0 |
| 0.6729166666666666 | 0 |
| 0.6736111111111112 | 0 |
| 0.6743055555555556 | 0 |
| 0.6749999999999999 | 0 |
| 0.6756944444444444 | 0 |
| 0.6763888888888889 | 0 |
| 0.6770833333333334 | 0 |
| 0.6777777777777777 | 0 |
| 0.6784722222222223 | 0 |
| 0.6791666666666667 | 0 |
| 0.6798611111111111 | 0 |
| 0.6805555555555555 | 0 |
| 0.68125 | 0 |
| 0.6819444444444445 | 0 |
| 0.6826388888888889 | 0 |
| 0.6833333333333332 | 0 |
| 0.6840277777777778 | 0 |
| 0.6847222222222222 | 0 |
| 0.6854166666666667 | 0 |
| 0.686111111111111 | 0 |
| 0.6868055555555556 | 0 |
| 0.6875 | 0 |
| 0.6881944444444444 | 0 |
| 0.688888888888889 | 0 |
| 0.6895833333333333 | 0 |
| 0.6902777777777778 | 0 |
| 0.6909722222222222 | 0 |
| 0.6916666666666668 | 0 |
| 0.6923611111111111 | 0 |
| 0.6930555555555555 | 0 |
| 0.69375 | 0 |
| 0.6944444444444445 | 0 |
| 0.6951388888888889 | 0 |
| 0.6958333333333333 | 0 |
| 0.6965277777777777 | 0 |
| 0.6972222222222223 | 0 |
| 0.6979166666666666 | 0 |
| 0.6986111111111111 | 0 |
| 0.6993055555555556 | 0 |
| 0.7000000000000001 | 0 |
| 0.7006944444444444 | 0 |
| 0.7013888888888888 | 0 |
| 0.7020833333333334 | 0 |
| 0.7027777777777778 | 0 |
| 0.7034722222222222 | 0 |
| 0.7041666666666666 | 0 |
| 0.7048611111111112 | 0 |
| 0.7055555555555556 | 0 |
| 0.7062499999999999 | 0 |
| 0.7069444444444444 | 0 |
| 0.7076388888888889 | 0 |
| 0.7083333333333334 | 0 |
| 0.7090277777777777 | 0 |
| 0.7097222222222223 | 0 |
| 0.7104166666666667 | 0 |
| 0.7111111111111111 | 0 |
| 0.7118055555555555 | 0 |
| 0.7125 | 0 |
| 0.7131944444444445 | 0 |
| 0.7138888888888889 | 0 |
| 0.7145833333333332 | 0 |
| 0.7152777777777778 | 0 |
| 0.7159722222222222 | 0 |
| 0.7166666666666667 | 0 |
| 0.717361111111111 | 0 |
| 0.7180555555555556 | 0 |
| 0.71875 | 0 |
| 0.7194444444444444 | 0 |
| 0.720138888888889 | 0 |
| 0.7208333333333333 | 0 |
| 0.7215277777777778 | 0 |
| 0.7222222222222222 | 0 |
| 0.7229166666666668 | 0 |
| 0.7236111111111111 | 0 |
| 0.7243055555555555 | 0 |
| 0.725 | 0 |
| 0.7256944444444445 | 0 |
| 0.7263888888888889 | 0 |
| 0.7270833333333333 | 0 |
| 0.7277777777777777 | 0 |
| 0.7284722222222223 | 0 |
| 0.7291666666666666 | 0 |
| 0.7298611111111111 | 0 |
| 0.7305555555555556 | 0 |
| 0.7312500000000001 | 0 |
| 0.7319444444444444 | 0 |
| 0.7326388888888888 | 0 |
| 0.7333333333333334 | 0 |
| 0.7340277777777778 | 0 |
| 0.7347222222222222 | 0 |
| 0.7354166666666666 | 0 |
| 0.7361111111111112 | 0 |
| 0.7368055555555556 | 0 |
| 0.7374999999999999 | 0 |
| 0.7381944444444444 | 0 |
| 0.7388888888888889 | 0 |
| 0.7395833333333334 | 0 |
| 0.7402777777777777 | 0 |
| 0.7409722222222223 | 0 |
| 0.7416666666666667 | 0 |
| 0.7423611111111111 | 0 |
| 0.7430555555555555 | 0 |
| 0.74375 | 0 |
| 0.7444444444444445 | 0 |
| 0.7451388888888889 | 0 |
| 0.7458333333333332 | 0 |
| 0.7465277777777778 | 0 |
| 0.7472222222222222 | 0 |
| 0.7479166666666667 | 0 |
| 0.748611111111111 | 0 |
| 0.7493055555555556 | 0 |
| 0.75 | 0 |
| 0.7506944444444444 | 0 |
| 0.751388888888889 | 0 |
| 0.7520833333333333 | 0 |
| 0.7527777777777778 | 0 |
| 0.7534722222222222 | 0 |
| 0.7541666666666668 | 0 |
| 0.7548611111111111 | 0 |
| 0.7555555555555555 | 0 |
| 0.75625 | 0 |
| 0.7569444444444445 | 0 |
| 0.7576388888888889 | 0 |
| 0.7583333333333333 | 0 |
| 0.7590277777777777 | 0 |
| 0.7597222222222223 | 0 |
| 0.7604166666666666 | 0 |
| 0.7611111111111111 | 0 |
| 0.7618055555555556 | 0 |
| 0.7625000000000001 | 0 |
| 0.7631944444444444 | 0 |
| 0.7638888888888888 | 0 |
| 0.7645833333333334 | 0 |
| 0.7652777777777778 | 0 |
| 0.7659722222222222 | 0 |
| 0.7666666666666666 | 0 |
| 0.7673611111111112 | 0 |
| 0.7680555555555556 | 0 |
| 0.7687499999999999 | 0 |
| 0.7694444444444444 | 0 |
| 0.7701388888888889 | 0 |
| 0.7708333333333334 | 0 |
| 0.7715277777777777 | 0 |
| 0.7722222222222223 | 0 |
| 0.7729166666666667 | 0 |
| 0.7736111111111111 | 0 |
| 0.7743055555555555 | 0 |
| 0.775 | 0 |
| 0.7756944444444445 | 0 |
| 0.7763888888888889 | 0 |
| 0.7770833333333332 | 0 |
| 0.7777777777777778 | 0 |
| 0.7784722222222222 | 0 |
| 0.7791666666666667 | 0 |
| 0.779861111111111 | 0 |
| 0.7805555555555556 | 0 |
| 0.78125 | 0 |
| 0.7819444444444444 | 0 |
| 0.782638888888889 | 0 |
| 0.7833333333333333 | 0 |
| 0.7840277777777778 | 0 |
| 0.7847222222222222 | 0 |
| 0.7854166666666668 | 0 |
| 0.7861111111111111 | 0 |
| 0.7868055555555555 | 0 |
| 0.7875 | 0 |
| 0.7881944444444445 | 0 |
| 0.7888888888888889 | 0 |
| 0.7895833333333333 | 0 |
| 0.7902777777777777 | 0 |
| 0.7909722222222223 | 0 |
| 0.7916666666666666 | 0 |
| 0.7923611111111111 | 0 |
| 0.7930555555555556 | 0 |
| 0.7937500000000001 | 0 |
| 0.7944444444444444 | 0 |
| 0.7951388888888888 | 0 |
| 0.7958333333333334 | 0 |
| 0.7965277777777778 | 0 |
| 0.7972222222222222 | 0 |
| 0.7979166666666666 | 0 |
| 0.7986111111111112 | 0 |
| 0.7993055555555556 | 0 |
| 0.7999999999999999 | 0 |
| 0.8006944444444444 | 0 |
| 0.8013888888888889 | 0 |
| 0.8020833333333334 | 0 |
| 0.8027777777777777 | 0 |
| 0.8034722222222223 | 0 |
| 0.8041666666666667 | 0 |
| 0.8048611111111111 | 0 |
| 0.8055555555555555 | 0 |
| 0.80625 | 0 |
| 0.8069444444444445 | 0 |
| 0.8076388888888889 | 0 |
| 0.8083333333333332 | 0 |
| 0.8090277777777778 | 0 |
| 0.8097222222222222 | 0 |
| 0.8104166666666667 | 0 |
| 0.811111111111111 | 0 |
| 0.8118055555555556 | 0 |
| 0.8125 | 0 |
| 0.8131944444444444 | 0 |
| 0.813888888888889 | 0 |
| 0.8145833333333333 | 0 |
| 0.8152777777777778 | 0 |
| 0.8159722222222222 | 0 |
| 0.8166666666666668 | 0 |
| 0.8173611111111111 | 0 |
| 0.8180555555555555 | 0 |
| 0.81875 | 0 |
| 0.8194444444444445 | 0 |
| 0.8201388888888889 | 0 |
| 0.8208333333333333 | 0 |
| 0.8215277777777777 | 0 |
| 0.8222222222222223 | 0 |
| 0.8229166666666666 | 0 |
| 0.8236111111111111 | 0 |
| 0.8243055555555556 | 0 |
| 0.8250000000000001 | 0 |
| 0.8256944444444444 | 0 |
| 0.8263888888888888 | 0 |
| 0.8270833333333334 | 0 |
| 0.8277777777777778 | 0 |
| 0.8284722222222222 | 0 |
| 0.8291666666666666 | 0 |
| 0.8298611111111112 | 0 |
| 0.8305555555555556 | 0 |
| 0.8312499999999999 | 0 |
| 0.8319444444444444 | 0 |
| 0.8326388888888889 | 0 |
| 0.8333333333333334 | 0 |
| 0.8340277777777777 | 0 |
| 0.8347222222222223 | 0 |
| 0.8354166666666667 | 0 |
| 0.8361111111111111 | 0 |
| 0.8368055555555555 | 0 |
| 0.8375 | 0 |
| 0.8381944444444445 | 0 |
| 0.8388888888888889 | 0 |
| 0.8395833333333332 | 0 |
| 0.8402777777777778 | 0 |
| 0.8409722222222222 | 0 |
| 0.8416666666666667 | 0 |
| 0.842361111111111 | 0 |
| 0.8430555555555556 | 0 |
| 0.84375 | 0 |
| 0.8444444444444444 | 0 |
| 0.845138888888889 | 0 |
| 0.8458333333333333 | 0 |
| 0.8465277777777778 | 0 |
| 0.8472222222222222 | 0 |
| 0.8479166666666668 | 0 |
| 0.8486111111111111 | 0 |
| 0.8493055555555555 | 0 |
| 0.85 | 0 |
| 0.8506944444444445 | 0 |
| 0.8513888888888889 | 0 |
| 0.8520833333333333 | 0 |
| 0.8527777777777777 | 0 |
| 0.8534722222222223 | 0 |
| 0.8541666666666666 | 0 |
| 0.8548611111111111 | 0 |
| 0.8555555555555556 | 0 |
| 0.8562500000000001 | 0 |
| 0.8569444444444444 | 0 |
| 0.8576388888888888 | 0 |
| 0.8583333333333334 | 0 |
| 0.8590277777777778 | 0 |
| 0.8597222222222222 | 0 |
| 0.8604166666666666 | 0 |
| 0.8611111111111112 | 0 |
| 0.8618055555555556 | 0 |
| 0.8624999999999999 | 0 |
| 0.8631944444444444 | 0 |
| 0.8638888888888889 | 0 |
| 0.8645833333333334 | 0 |
| 0.8652777777777777 | 0 |
| 0.8659722222222223 | 0 |
| 0.8666666666666667 | 0 |
| 0.8673611111111111 | 0 |
| 0.8680555555555555 | 0 |
| 0.86875 | 0 |
| 0.8694444444444445 | 0 |
| 0.8701388888888889 | 0 |
| 0.8708333333333332 | 0 |
| 0.8715277777777778 | 0 |
| 0.8722222222222222 | 0 |
| 0.8729166666666667 | 0 |
| 0.873611111111111 | 0 |
| 0.8743055555555556 | 0 |
| 0.875 | 0 |
| 0.8756944444444444 | 0 |
| 0.876388888888889 | 0 |
| 0.8770833333333333 | 0 |
| 0.8777777777777778 | 0 |
| 0.8784722222222222 | 0 |
| 0.8791666666666668 | 0 |
| 0.8798611111111111 | 0 |
| 0.8805555555555555 | 0 |
| 0.88125 | 0 |
| 0.8819444444444445 | 0 |
| 0.8826388888888889 | 0 |
| 0.8833333333333333 | 0 |
| 0.8840277777777777 | 0 |
| 0.8847222222222223 | 0 |
| 0.8854166666666666 | 0 |
| 0.8861111111111111 | 0 |
| 0.8868055555555556 | 0 |
| 0.8875000000000001 | 0 |
| 0.8881944444444444 | 0 |
| 0.8888888888888888 | 0 |
| 0.8895833333333334 | 0 |
| 0.8902777777777778 | 0 |
| 0.8909722222222222 | 0 |
| 0.8916666666666666 | 0 |
| 0.8923611111111112 | 0 |
| 0.8930555555555556 | 0 |
| 0.8937499999999999 | 0 |
| 0.8944444444444444 | 0 |
| 0.8951388888888889 | 0 |
| 0.8958333333333334 | 0 |
| 0.8965277777777777 | 0 |
| 0.8972222222222223 | 0 |
| 0.8979166666666667 | 0 |
| 0.8986111111111111 | 0 |
| 0.8993055555555555 | 0 |
| 0.9 | 0 |
| 0.9006944444444445 | 0 |
| 0.9013888888888889 | 0 |
| 0.9020833333333332 | 0 |
| 0.9027777777777778 | 0 |
| 0.9034722222222222 | 0 |
| 0.9041666666666667 | 0 |
| 0.904861111111111 | 0 |
| 0.9055555555555556 | 0 |
| 0.90625 | 0 |
| 0.9069444444444444 | 0 |
| 0.907638888888889 | 0 |
| 0.9083333333333333 | 0 |
| 0.9090277777777778 | 0 |
| 0.9097222222222222 | 0 |
| 0.9104166666666668 | 0 |
| 0.9111111111111111 | 0 |
| 0.9118055555555555 | 0 |
| 0.9125 | 0 |
| 0.9131944444444445 | 0 |
| 0.9138888888888889 | 0 |
| 0.9145833333333333 | 0 |
| 0.9152777777777777 | 0 |
| 0.9159722222222223 | 0 |
| 0.9166666666666666 | 0 |
| 0.9173611111111111 | 0 |
| 0.9180555555555556 | 0 |
| 0.9187500000000001 | 0 |
| 0.9194444444444444 | 0 |
| 0.9201388888888888 | 0 |
| 0.9208333333333334 | 0 |
| 0.9215277777777778 | 0 |
| 0.9222222222222222 | 0 |
| 0.9229166666666666 | 0 |
| 0.9236111111111112 | 0 |
| 0.9243055555555556 | 0 |
| 0.9249999999999999 | 0 |
| 0.9256944444444444 | 0 |
| 0.9263888888888889 | 0 |
| 0.9270833333333334 | 0 |
| 0.9277777777777777 | 0 |
| 0.9284722222222223 | 0 |
| 0.9291666666666667 | 0 |
| 0.9298611111111111 | 0 |
| 0.9305555555555555 | 0 |
| 0.93125 | 0 |
| 0.9319444444444445 | 0 |
| 0.9326388888888889 | 0 |
| 0.9333333333333332 | 0 |
| 0.9340277777777778 | 0 |
| 0.9347222222222222 | 0 |
| 0.9354166666666667 | 0 |
| 0.936111111111111 | 0 |
| 0.9368055555555556 | 0 |
| 0.9375 | 0 |
| 0.9381944444444444 | 0 |
| 0.938888888888889 | 0 |
| 0.9395833333333333 | 0 |
| 0.9402777777777778 | 0 |
| 0.9409722222222222 | 0 |
| 0.9416666666666668 | 0 |
| 0.9423611111111111 | 0 |
| 0.9430555555555555 | 0 |
| 0.94375 | 0 |
| 0.9444444444444445 | 0 |
| 0.9451388888888889 | 0 |
| 0.9458333333333333 | 0 |
| 0.9465277777777777 | 0 |
| 0.9472222222222223 | 0 |
| 0.9479166666666666 | 0 |
| 0.9486111111111111 | 0 |
| 0.9493055555555556 | 0 |
| 0.9500000000000001 | 0 |
| 0.9506944444444444 | 0 |
| 0.9513888888888888 | 0 |
| 0.9520833333333334 | 0 |
| 0.9527777777777778 | 0 |
| 0.9534722222222222 | 0 |
| 0.9541666666666666 | 0 |
| 0.9548611111111112 | 0 |
| 0.9555555555555556 | 0 |
| 0.9562499999999999 | 0 |
| 0.9569444444444444 | 0 |
| 0.9576388888888889 | 0 |
| 0.9583333333333334 | 0 |
| 0.9590277777777777 | 0 |
| 0.9597222222222223 | 0 |
| 0.9604166666666667 | 0 |
| 0.9611111111111111 | 0 |
| 0.9618055555555555 | 0 |
| 0.9625 | 0 |
| 0.9631944444444445 | 0 |
| 0.9638888888888889 | 0 |
| 0.9645833333333332 | 0 |
| 0.9652777777777778 | 0 |
| 0.9659722222222222 | 0 |
| 0.9666666666666667 | 0 |
| 0.967361111111111 | 0 |
| 0.9680555555555556 | 0 |
| 0.96875 | 0 |
| 0.9694444444444444 | 0 |
| 0.970138888888889 | 0 |
| 0.9708333333333333 | 0 |
| 0.9715277777777778 | 0 |
| 0.9722222222222222 | 0 |
| 0.9729166666666668 | 0 |
| 0.9736111111111111 | 0 |
| 0.9743055555555555 | 0 |
| 0.975 | 0 |
| 0.9756944444444445 | 0 |
| 0.9763888888888889 | 0 |
| 0.9770833333333333 | 0 |
| 0.9777777777777777 | 0 |
| 0.9784722222222223 | 0 |
| 0.9791666666666666 | 0 |
| 0.9798611111111111 | 0 |
| 0.9805555555555556 | 0 |
| 0.9812500000000001 | 0 |
| 0.9819444444444444 | 0 |
| 0.9826388888888888 | 0 |
| 0.9833333333333334 | 0 |
| 0.9840277777777778 | 0 |
| 0.9847222222222222 | 0 |
| 0.9854166666666666 | 0 |
| 0.9861111111111112 | 0 |
| 0.9868055555555556 | 0 |
| 0.9874999999999999 | 0 |
| 0.9881944444444444 | 0 |
| 0.9888888888888889 | 0 |
| 0.9895833333333334 | 0 |
| 0.9902777777777777 | 0 |
| 0.9909722222222223 | 0 |
| 0.9916666666666667 | 0 |
| 0.9923611111111111 | 0 |
| 0.9930555555555555 | 0 |
| 0.99375 | 0 |
| 0.9944444444444445 | 0 |
| 0.9951388888888889 | 0 |
| 0.9958333333333332 | 0 |
| 0.9965277777777778 | 0 |
| 0.9972222222222222 | 0 |
| 0.9979166666666667 | 0 |
| 0.998611111111111 | 0 |
| 0.9993055555555556 | 0 |